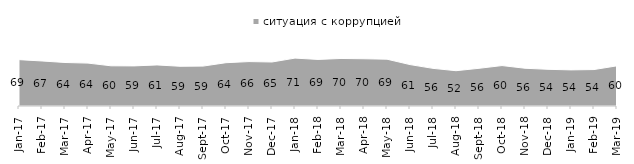
| Category | ситуация с коррупцией |
|---|---|
| 2017-01-01 | 68.7 |
| 2017-02-01 | 66.7 |
| 2017-03-01 | 64.45 |
| 2017-04-01 | 63.55 |
| 2017-05-01 | 59.55 |
| 2017-06-01 | 59.4 |
| 2017-07-01 | 60.85 |
| 2017-08-01 | 58.85 |
| 2017-09-01 | 59.1 |
| 2017-10-01 | 64.15 |
| 2017-11-01 | 65.8 |
| 2017-12-01 | 65.2 |
| 2018-01-01 | 70.95 |
| 2018-02-01 | 69 |
| 2018-03-01 | 70.4 |
| 2018-04-01 | 70 |
| 2018-05-01 | 69.35 |
| 2018-06-01 | 61.35 |
| 2018-07-01 | 55.75 |
| 2018-08-01 | 52.3 |
| 2018-09-01 | 55.85 |
| 2018-10-01 | 59.9 |
| 2018-11-01 | 55.938 |
| 2018-12-01 | 54.35 |
| 2019-01-01 | 53.5 |
| 2019-02-01 | 54 |
| 2019-03-01 | 59.523 |